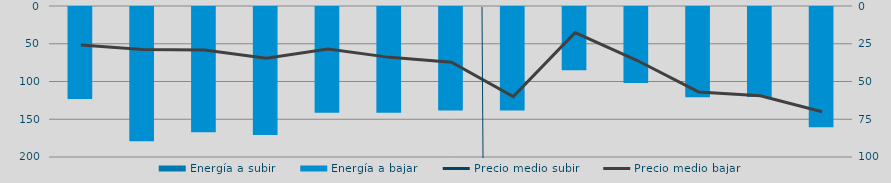
| Category | Energía a subir | Energía a bajar |
|---|---|---|
| D |  | 123.137 |
| E |  | 178.975 |
| F |  | 167.321 |
| M |  | 170.789 |
| A |  | 141.32 |
| M |  | 141.434 |
| J |  | 138.263 |
| J |  | 138.335 |
| A |  | 85.107 |
| S |  | 101.943 |
| O |  | 121.02 |
| N |  | 120.376 |
| D |  | 160.575 |